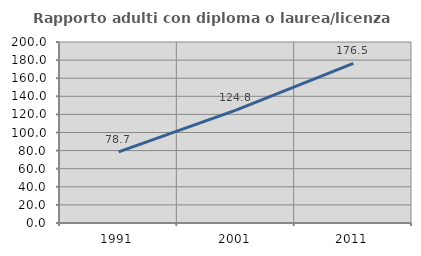
| Category | Rapporto adulti con diploma o laurea/licenza media  |
|---|---|
| 1991.0 | 78.684 |
| 2001.0 | 124.752 |
| 2011.0 | 176.486 |